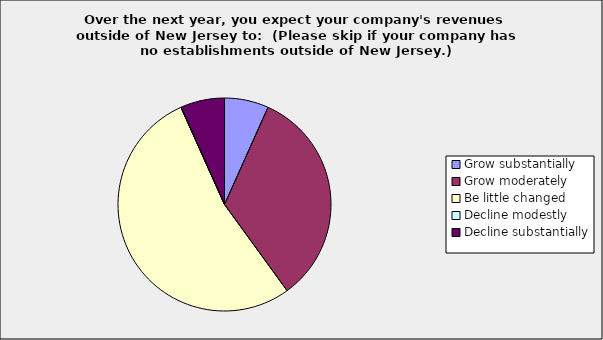
| Category | Series 0 |
|---|---|
| Grow substantially | 0.067 |
| Grow moderately | 0.333 |
| Be little changed | 0.533 |
| Decline modestly | 0 |
| Decline substantially | 0.067 |